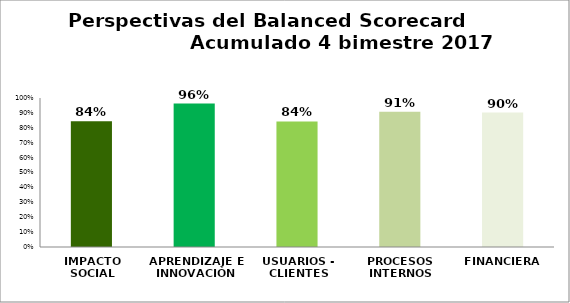
| Category | Series 0 |
|---|---|
| IMPACTO SOCIAL | 0.844 |
| APRENDIZAJE E INNOVACIÓN | 0.963 |
| USUARIOS - CLIENTES | 0.842 |
| PROCESOS INTERNOS | 0.908 |
| FINANCIERA | 0.902 |